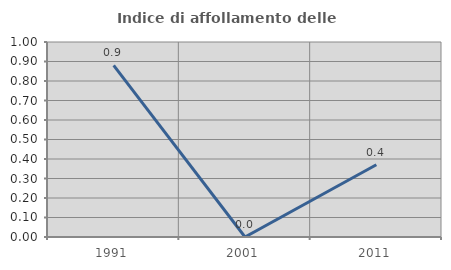
| Category | Indice di affollamento delle abitazioni  |
|---|---|
| 1991.0 | 0.88 |
| 2001.0 | 0 |
| 2011.0 | 0.37 |